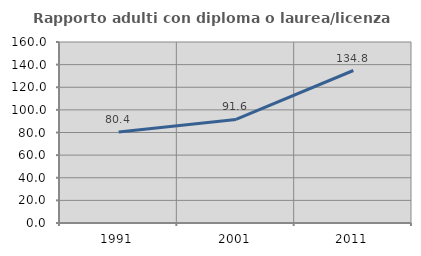
| Category | Rapporto adulti con diploma o laurea/licenza media  |
|---|---|
| 1991.0 | 80.435 |
| 2001.0 | 91.569 |
| 2011.0 | 134.805 |